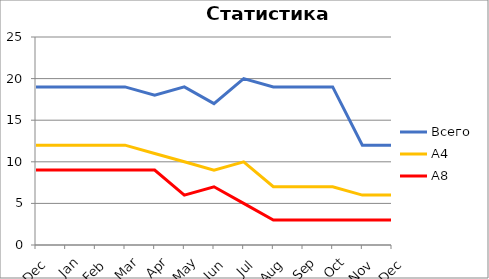
| Category | Всего | А4 | A8 |
|---|---|---|---|
| 0 | 19 | 12 | 9 |
| 1 | 19 | 12 | 9 |
| 2 | 19 | 12 | 9 |
| 3 | 19 | 12 | 9 |
| 4 | 18 | 11 | 9 |
| 5 | 19 | 10 | 6 |
| 6 | 17 | 9 | 7 |
| 7 | 20 | 10 | 5 |
| 8 | 19 | 7 | 3 |
| 9 | 19 | 7 | 3 |
| 10 | 19 | 7 | 3 |
| 11 | 12 | 6 | 3 |
| 12 | 12 | 6 | 3 |